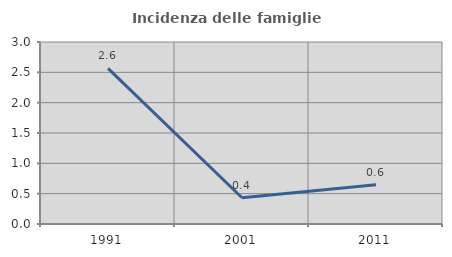
| Category | Incidenza delle famiglie numerose |
|---|---|
| 1991.0 | 2.564 |
| 2001.0 | 0.433 |
| 2011.0 | 0.647 |